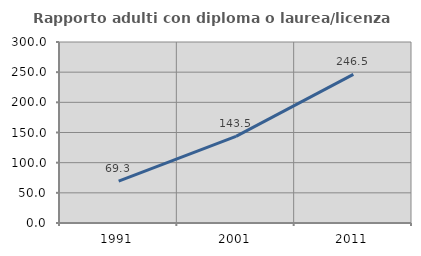
| Category | Rapporto adulti con diploma o laurea/licenza media  |
|---|---|
| 1991.0 | 69.298 |
| 2001.0 | 143.478 |
| 2011.0 | 246.465 |